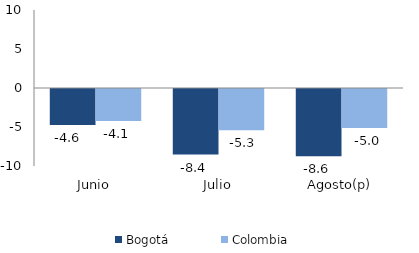
| Category | Bogotá | Colombia |
|---|---|---|
| Junio | -4.599 | -4.087 |
| Julio | -8.407 | -5.28 |
| Agosto(p) | -8.637 | -4.999 |